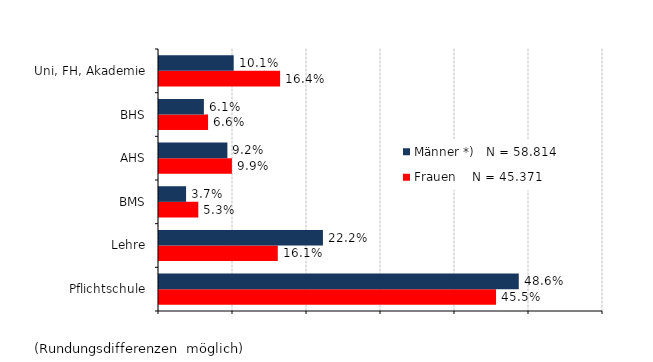
| Category | Frauen    N = 45.371 | Männer *)   N = 58.814 |
|---|---|---|
| Pflichtschule | 0.455 | 0.486 |
| Lehre | 0.161 | 0.222 |
| BMS | 0.053 | 0.037 |
| AHS | 0.099 | 0.092 |
| BHS | 0.066 | 0.061 |
| Uni, FH, Akademie | 0.164 | 0.101 |